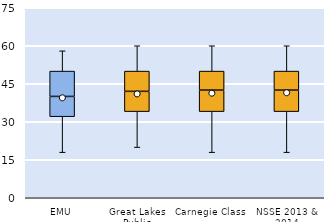
| Category | 25th | 50th | 75th |
|---|---|---|---|
| EMU | 32 | 8 | 10 |
| Great Lakes Public | 34 | 8 | 8 |
| Carnegie Class | 34 | 8.5 | 7.5 |
| NSSE 2013 & 2014 | 34 | 8.5 | 7.5 |